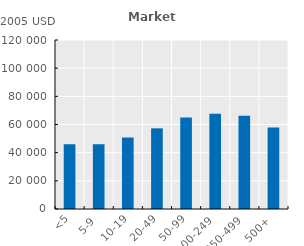
| Category | Series 0 |
|---|---|
| <5 | 45949.984 |
| 5-9 | 46038.043 |
| 10-19 | 50693.148 |
| 20-49 | 57264.02 |
| 50-99 | 64956.496 |
| 100-249 | 67602.969 |
| 250-499 | 66176.891 |
| 500+ | 57847.266 |